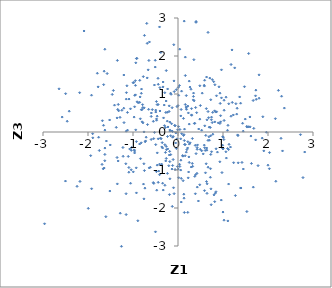
| Category | Series 0 |
|---|---|
| 2.03120851423108 | -0.966 |
| 0.6380926272378209 | -0.421 |
| 1.4215352233544785 | -0.802 |
| 0.0618896957430254 | 0.423 |
| 1.2871835639577025 | 0.745 |
| -1.0912993337554795 | -0.935 |
| 0.7930680771447751 | 1.324 |
| 0.8462634296984827 | -0.442 |
| 0.27058960232429025 | -0.286 |
| 0.584641239548479 | -0.345 |
| 1.2364435287591777 | -0.808 |
| 2.1742855629542954 | -1.297 |
| 0.3863876955118836 | -1.626 |
| -0.2788882041977651 | -0.538 |
| -0.23696091154944107 | 0.287 |
| 0.9925461143902533 | -0.348 |
| -1.0728897451103232 | -0.447 |
| 1.8713023107273214 | -0.161 |
| 0.9657842777513779 | 1.636 |
| 0.4147450287659612 | 0.508 |
| 0.05975740389826087 | -0.18 |
| 1.3254545573414571 | -0.077 |
| 0.37273713275025366 | -1.167 |
| -1.3186778673241994 | 0.557 |
| -0.7453621162487355 | 2.542 |
| -2.2430237134671027 | -1.43 |
| -0.8328264022142614 | -0.703 |
| 0.23135628487303236 | 0.502 |
| -0.3613692791000093 | -0.847 |
| 1.134409014168927 | -0.324 |
| -0.9085548721926571 | 0.794 |
| -0.10742648629825179 | -0.726 |
| -1.652052161703114 | 1.246 |
| 0.6679956220573496 | 2.621 |
| 0.15823453677162813 | -0.625 |
| -1.3715809611399337 | 0.122 |
| 0.5263265302888538 | 0.047 |
| -0.97220790066872 | -0.472 |
| -0.8493367787775357 | 1.36 |
| 0.1410190143220701 | -2.118 |
| 0.3930467419920333 | -1.123 |
| -1.5740185364087167 | 1.538 |
| -1.9400056026471983 | -0.623 |
| -1.5196097550640792 | 0.316 |
| -1.1492986922592545 | 0.866 |
| -0.26058699950445463 | -0.696 |
| -0.5232322655399885 | 1.236 |
| 0.6447142994476656 | 0.32 |
| -0.09943830213728103 | -1.468 |
| -1.5907675174995723 | -0.238 |
| -0.008364926096423737 | 0.057 |
| 0.48386190445106075 | -1.389 |
| 0.10229563728664204 | -0.619 |
| 0.965633094822023 | 0.898 |
| -0.35112947069924044 | -0.28 |
| -0.8148555747264425 | 1.019 |
| -0.9273283446574865 | -0.943 |
| 0.16307379601566113 | -0.332 |
| 1.9068514845797053 | -0.497 |
| -0.885749578718171 | 0.77 |
| -0.2565232240090893 | -0.466 |
| 0.1854646355270571 | -0.529 |
| -0.5481054931863547 | 0.281 |
| 1.3323276474267511 | -0.095 |
| 2.8156992451498764 | -0.528 |
| -1.247214070944625 | 0.572 |
| -2.1781296409141184 | -1.301 |
| -1.2049699411168855 | 0.626 |
| 0.48533245789821655 | 0.339 |
| -0.22814747345436087 | -0.446 |
| 0.538850646723118 | 1.022 |
| -0.7074288939866151 | -0.136 |
| 0.6046063527278297 | -0.486 |
| 0.6673271521674686 | 0.539 |
| -0.23301209197587175 | -0.119 |
| 1.2291107610464314 | 0.449 |
| 1.0228488442547026 | -2.321 |
| -1.0296401667276533 | -0.406 |
| 0.16189976953480814 | 0.724 |
| 0.937708650166596 | 0.752 |
| -0.30563871869331644 | 0.71 |
| 0.039771138110173715 | -0.907 |
| -1.5145159712610154 | -1.554 |
| -0.5919505054547642 | 0.5 |
| 0.9461397636297907 | 0.429 |
| -1.7748875279486203 | 1.187 |
| -0.11936705202457763 | -0.882 |
| -0.4634168051360489 | 0.72 |
| 1.965085368716691 | -0.007 |
| 0.8401632316051432 | 0.525 |
| -0.8414974713543812 | 0.923 |
| -1.6402911486849379 | -0.948 |
| 1.7796479881384117 | -0.885 |
| -0.08929741519572655 | 1.344 |
| -0.40924532624341775 | -0.845 |
| 0.3429393575789887 | 0.937 |
| -0.27264081102165105 | -0.762 |
| -0.8517087687031069 | 0.78 |
| -0.37370570140455733 | -0.176 |
| -0.476547050783232 | 0.344 |
| 0.40008693374644544 | 2.886 |
| -0.060421957189233995 | 0.165 |
| 0.7995662872111217 | -1.656 |
| 0.39215776956178894 | 0.643 |
| 0.3009875541715066 | 0.615 |
| 0.7704574229073521 | 0.517 |
| 0.28906624776493384 | 1.125 |
| 0.06446833580910417 | -0.741 |
| 0.728156360859254 | -0.59 |
| -1.7923624472891055 | 1.546 |
| 0.6807604722381256 | 0.378 |
| -2.497519738398751 | 1.008 |
| -0.7566583099842213 | -1.76 |
| 0.6982812051356887 | -0.216 |
| 0.26706845391375206 | 1.182 |
| -0.36017406429110804 | -0.393 |
| 1.5377600927129589 | 0.13 |
| 0.4214161121138919 | -1.088 |
| -0.19297654349107266 | -0.605 |
| 1.7248337317978 | -0.208 |
| -0.6627876932471145 | 1.635 |
| 0.5865276189380716 | 1.209 |
| 1.3702576745402866 | 0.922 |
| 0.4018738840208439 | 2.91 |
| -1.6548899417173972 | 0.176 |
| -0.45964475560049683 | -0.549 |
| 1.1277428742198505 | 0.743 |
| -0.7569702016612629 | -0.836 |
| 0.8962726876906973 | 0.24 |
| 0.13141079204823944 | -0.07 |
| -0.7992497752973948 | 0.592 |
| -1.354093013204005 | 0.371 |
| -0.02038424237595726 | -0.18 |
| -0.4020543587169101 | 1.168 |
| 2.3637858296864778 | 0.629 |
| 1.8017494110050138 | 1.504 |
| -1.6248903029922162 | -0.589 |
| 1.107535789450467 | -2.34 |
| 1.02511469022449 | 0.573 |
| 1.124490385677927 | -1.37 |
| -0.20452158779356414 | -0.887 |
| 0.21791251330639946 | -2.115 |
| 0.7603294801492564 | 0.248 |
| -1.1221912471282933 | 0.049 |
| -0.9473024651688603 | 1.351 |
| -0.6839311623696789 | 1.423 |
| 0.06006999809032871 | -1.002 |
| 0.74394610508488 | 3.056 |
| 0.012352982368187744 | 0.142 |
| -0.036660278153925294 | -0.434 |
| 0.8759512670555262 | -0.529 |
| 1.7371826693139243 | 0.859 |
| 0.9998305357418359 | -2.107 |
| -1.0396209677074673 | -0.994 |
| -0.4620714014825965 | -0.872 |
| -0.4434293036537461 | 1.413 |
| 1.7230553890210984 | 0.952 |
| -1.8965632460419617 | -0.045 |
| 1.6321263505984813 | -0.828 |
| 1.3044683222252125 | 0.471 |
| 0.6270576053918596 | -0.836 |
| -1.1990208308441903 | 0.247 |
| -0.8107079895781242 | 1.13 |
| -1.0547100080356224 | -1.349 |
| -1.2564277797134944 | -3.008 |
| -1.2231836051660467 | -0.408 |
| 0.2505121692383727 | -0.319 |
| -1.6794287548294566 | 0.296 |
| -0.161897620538353 | -0.596 |
| -0.4387068804111355 | 1.256 |
| 0.07042692341648597 | 0.592 |
| -0.15282315113330683 | 0.993 |
| 0.2193886782159087 | -0.256 |
| -0.9743392692940336 | 0.392 |
| 0.7225413625836373 | -0.967 |
| -0.1890637602398564 | -1.648 |
| -0.8367251421221276 | 0.347 |
| -1.3274569233412323 | 0.724 |
| -0.7351056484581358 | -1.478 |
| 0.16327254812980477 | 1.971 |
| 1.5706775862478974 | 2.065 |
| -0.2797782534020779 | 0.117 |
| -0.1644393758504463 | -0.097 |
| -0.4004850732525856 | 0.553 |
| 1.6708999540223062 | 0.829 |
| 1.7305088911863902 | 1.102 |
| -1.1051419062858445 | -0.643 |
| 2.322770487876884 | -0.498 |
| -0.18042515946923676 | 0.024 |
| -0.7703487089854117 | 1.457 |
| -0.684670462488979 | 2.334 |
| -1.686992137810337 | -0.853 |
| 2.721983637185016 | -0.07 |
| 0.7377783120565559 | -1.914 |
| 0.7427711868332664 | 0.323 |
| -0.012841215020552412 | -0.91 |
| 0.1400481435943803 | -0.225 |
| -0.4934629812035567 | 0.525 |
| 0.07258738315439299 | -1.843 |
| 1.477605541478177 | 1.192 |
| -0.9929209013687255 | -1.049 |
| -0.2348178730352613 | -1.089 |
| 0.2491505033797529 | -0.801 |
| -1.5051274356364979 | -0.342 |
| -1.150956721967325 | 0.021 |
| -0.537643223693889 | -1.353 |
| -1.6411467370087576 | 1.6 |
| -0.14312733058023439 | 0.218 |
| 0.6473122687963895 | -1.363 |
| 0.18446660798281334 | 0.958 |
| 0.7623350221390072 | 1.379 |
| -0.32774831379401514 | -1.528 |
| -2.6429426375321503 | 1.136 |
| -0.06514262615544474 | -0.987 |
| -2.461531669959255 | 0.283 |
| 1.8855890083727507 | 0.401 |
| 1.5288729477324603 | 0.147 |
| -0.34150597227342133 | -1.348 |
| -0.7205171014917541 | -0.235 |
| -1.7639146915076378 | -0.138 |
| 2.2309473395456876 | 1.096 |
| -1.055628881598338 | 0.611 |
| 1.1245676795719182 | -0.462 |
| -2.5738054900689793 | 0.393 |
| -0.9242831362350243 | 1.933 |
| 0.1223821104752984 | -0.092 |
| -1.3470978771586666 | 1.884 |
| -1.6243173671698863 | -0.423 |
| 0.7269526556662154 | -0.099 |
| 1.4517923454722974 | -0.974 |
| 0.35846074913876164 | 0.82 |
| 1.530766743200824 | -2.094 |
| 0.6411043289936558 | -0.478 |
| 0.930060546517262 | -0.784 |
| 1.4496550983388448 | 0.023 |
| 1.3973886770123323 | -1.475 |
| 1.495305630408304 | 0.34 |
| 0.4605828165743575 | 0.079 |
| 0.0009683490402720616 | 0.694 |
| 1.3386330393836674 | -0.811 |
| 0.18466531357444652 | 0.635 |
| 0.3255815486018691 | -0.903 |
| 0.8207917245757703 | 1.244 |
| 0.6300237274436138 | 0.615 |
| 0.21849207642636712 | 0.682 |
| -0.8525391313065561 | -0.316 |
| 1.0189097840616879 | -0.197 |
| 0.8580550240556609 | 0.532 |
| -0.5703243668184629 | 0.59 |
| -0.22290164902077086 | 0.133 |
| 0.7737841573645526 | -0.058 |
| -0.3329020734951593 | 1.186 |
| 0.014466404233050721 | 0.967 |
| -0.47932740461851436 | -1.044 |
| 1.166313108658835 | -0.396 |
| -1.2082964251904524 | -3.179 |
| 1.1782644466162628 | 0.415 |
| 0.582359482567699 | 1.231 |
| -0.998270020390144 | 1.296 |
| 1.6741657172903954 | -1.451 |
| 0.12951236497136356 | -1.637 |
| 0.24149042080330654 | -0.656 |
| -0.18139645717775035 | -0.779 |
| 0.29500544096791476 | -0.922 |
| 0.7172116966502751 | 0.119 |
| 1.3911014773454884 | 0.758 |
| 0.03713304754663213 | 2.18 |
| -0.39100588903861505 | -0.163 |
| 0.08205308102389465 | -0.045 |
| -0.6399167408872265 | -0.945 |
| 1.2060936940360398 | 0.778 |
| -0.44075235989616585 | 0.723 |
| 2.164516187592801 | 0.351 |
| 0.13786097870815767 | 2.918 |
| -0.13467100871409543 | -0.975 |
| -1.3543679057872855 | -0.671 |
| -0.5004078524427933 | -2.627 |
| -0.3416345512434298 | -0.422 |
| 2.7777519810874005 | -1.2 |
| -0.1341500688076392 | 0.027 |
| -0.9601454968847273 | 0.964 |
| 1.065451192941444 | -0.521 |
| 0.7200896984920314 | -1.191 |
| 0.07952149311321782 | 1.075 |
| -0.5057784826144435 | 1.709 |
| 0.6675006922701778 | -0.221 |
| 0.8183338133844088 | 0.266 |
| 0.1346299387039487 | -1.742 |
| -0.18195284645186643 | 0.053 |
| 1.199997028593207 | 2.16 |
| 0.4293996564606899 | -1.45 |
| 0.0728032796922534 | -1.221 |
| -0.5405796804086312 | -0.174 |
| 0.24994116763161509 | 1.339 |
| 0.745408430749935 | 0.391 |
| 0.5912504489032662 | 1.362 |
| 0.424812553827198 | -0.409 |
| -0.04837940584732547 | -0.025 |
| 0.6877498062760925 | -0.126 |
| -0.43954886591281284 | -0.18 |
| 0.9954353611717833 | -0.123 |
| 0.8140417253766462 | 0.556 |
| -0.5954940584783552 | -0.196 |
| -0.4950673498922876 | -0.333 |
| -0.19877019459649387 | 0.54 |
| -1.2037998834773542 | 1.5 |
| -0.9449634964392402 | 1.227 |
| 0.30371903593215327 | 0.44 |
| 0.633009725398936 | -1.303 |
| 0.19031663947288083 | 0.596 |
| 0.7318729255203008 | -1.496 |
| 0.993985624217695 | -0.437 |
| -0.036864504043420766 | 1.115 |
| -0.9394030630191293 | 0.057 |
| 0.013533401087857526 | -1.202 |
| -0.18563038882263722 | -0.51 |
| -2.4170549401792125 | 0.548 |
| -1.0921739170660414 | -1.058 |
| 0.4335274350143891 | -0.34 |
| -1.7488944741817858 | -0.487 |
| -0.5057635131311345 | 1.888 |
| -0.9248015867194376 | -0.253 |
| -0.6940834797407236 | 2.858 |
| 0.9317173821395797 | 0.225 |
| 0.5930083537873714 | -0.414 |
| -0.29990974688999067 | 0.167 |
| -0.981614578872564 | 1.303 |
| -0.26290511926410376 | 0.816 |
| -0.9124929484648598 | 1.939 |
| 0.23572114740063294 | -1.052 |
| -1.1540884249497219 | -1.624 |
| -0.020744435640049352 | 0.667 |
| 0.12172405562661838 | 0.358 |
| -1.3295708914959001 | -0.763 |
| -1.3473858143056996 | -1.365 |
| 0.9470196670188338 | 0.267 |
| -0.5489218937078486 | -1.331 |
| 1.9992044398148632 | -0.873 |
| -0.7871500930391641 | 0.719 |
| 0.0058951784768085744 | -0.976 |
| -1.4616844609789088 | 0.988 |
| -0.28986976053490254 | -1.402 |
| 0.8157064643144257 | -1.834 |
| -0.2910733426304776 | -0.335 |
| 0.2277374185401185 | -1.207 |
| -0.4105093488334182 | 2.764 |
| -0.29394779858041803 | 1.033 |
| -0.6532174471195247 | 0.597 |
| -0.0862373369672945 | -1.622 |
| 0.3173431265591577 | -0.828 |
| 1.1013125204922698 | -0.435 |
| 0.006140326447311107 | 1.173 |
| -0.4768000741331179 | 0.31 |
| 0.32011671439693934 | -0.172 |
| 0.6178100060176094 | -0.089 |
| 0.4260579797188015 | -0.456 |
| 1.0751025652010318 | -0.686 |
| 0.1439486127769097 | -0.328 |
| -0.10716327246990236 | -0.118 |
| 0.03308653354793722 | 1.223 |
| -0.12078024508411091 | -0.137 |
| -0.18054337034168894 | 0.26 |
| 0.6937106047405537 | 0.129 |
| 2.2894471039196915 | -0.166 |
| -1.1594466017193161 | -0.836 |
| 1.0240311386956915 | 0.304 |
| 0.1971505121506946 | -0.464 |
| -1.1341601451981531 | 1.216 |
| 0.6346789868596819 | 1.446 |
| -0.3205978396403933 | 0.371 |
| -0.17944249516405425 | -1.232 |
| -0.4400805502876557 | -1.325 |
| 1.3140000217917003 | 0.625 |
| 0.6108421128553749 | -1.074 |
| -0.5955834725669198 | 0.409 |
| 0.855615215297404 | 0.953 |
| 1.1782188226554546 | 1.776 |
| -0.7972328177831958 | 0.267 |
| -1.4109622924836602 | 0.706 |
| -1.625612037393271 | 2.178 |
| 0.7278956877688509 | 0.849 |
| -0.5218045139452976 | -0.012 |
| 0.7070654520583484 | 1.419 |
| 1.6200741334289184 | -0.107 |
| 1.0038938931000294 | -0.441 |
| 0.34555199237786 | 1.024 |
| -0.26047740452521856 | 1.616 |
| -0.33065309071101906 | 1.316 |
| 0.5610930209270284 | -0.577 |
| 0.6448294316121703 | -1.615 |
| -0.7291953074585305 | -0.257 |
| 0.1627098468214491 | 1.486 |
| 0.10806705513290601 | -0.635 |
| -0.23066185847236864 | 1.132 |
| -0.13058077078449953 | 0.64 |
| 0.3738043040154474 | 0.229 |
| -0.7519250832502837 | 0.635 |
| -0.2711860943194124 | 0.514 |
| -0.4283547791153228 | -1.029 |
| 2.3011745348395247 | 0.942 |
| 1.1107377198049238 | 0.176 |
| 0.5255544155751644 | -0.495 |
| -0.008436983143597355 | 3.213 |
| -2.0876174370063887 | 2.658 |
| 0.033365693322464786 | -0.85 |
| -0.38038846715918156 | 2.094 |
| -1.892933264321624 | -0.154 |
| -1.624891904438697 | 0.05 |
| 0.49441417604134263 | -0.456 |
| 0.45406087381067256 | -1.816 |
| -0.23579583923886455 | 0.519 |
| 0.8441681775780651 | -1.573 |
| -1.9217714432936246 | 0.968 |
| -0.6765609200648942 | 0.196 |
| 0.3003734460664268 | 0.45 |
| 2.033859787535725 | -0.542 |
| 1.2755266423605045 | -1.673 |
| 0.2138581497499271 | -0.42 |
| -0.4790820664832568 | 0.802 |
| -0.1949523627932929 | 0.687 |
| -0.964569351903321 | -0.551 |
| -0.7828296145319283 | 0.645 |
| 0.401881140982674 | -0.569 |
| 0.33972314142154586 | 0.844 |
| 0.9623404707138572 | -1.791 |
| 1.0998468982848153 | 0.045 |
| -0.9639430109561117 | 0.664 |
| -0.8141293854772979 | 0.585 |
| 1.3911195833647891 | -1.472 |
| -1.1458534542879175 | 1.035 |
| -0.9463728537393533 | 0.977 |
| -1.3391975463264034 | 0.593 |
| 1.5712879758537097 | 0.139 |
| 0.589297844878256 | -1.543 |
| 0.3533681685030862 | 1.904 |
| -0.9374571678937006 | 1.82 |
| 0.5946823053230665 | 0.163 |
| 0.04165595418333012 | 0.066 |
| 1.0681359154028924 | 0.916 |
| 1.800937958205329 | 0.889 |
| -0.63431289390713 | 2.37 |
| -1.0874186199935965 | 0.867 |
| -0.09380515146080738 | 2.297 |
| -1.2825502376332092 | -2.137 |
| -1.288866934538377 | 0.385 |
| -0.16421377021390554 | 1.021 |
| -1.0374690937460773 | -0.483 |
| 0.9773195044921432 | -1.068 |
| 0.3831371519529941 | -0.351 |
| 0.668574057785756 | -0.926 |
| -2.500952602091171 | -1.291 |
| -0.6148336134026382 | -0.928 |
| 1.435324656595383 | 0.23 |
| -1.219514510356616 | -0.64 |
| -0.05292181436573296 | -0.289 |
| -0.4096523796771581 | -1.124 |
| 1.5976749934521814 | 0.396 |
| -0.47225388585296557 | -1.532 |
| 0.18493965334009704 | 0.661 |
| -0.7465162956745369 | -1.016 |
| -0.08236159391264086 | 1.064 |
| -0.7779508429586933 | 0.241 |
| -1.6025862443710306 | -2.228 |
| 1.259413293618899 | 1.687 |
| -1.9937018746077526 | -2.009 |
| -1.9202943591028194 | -1.493 |
| 0.14454123837671695 | 0.076 |
| -2.9657393285675475 | -2.415 |
| -1.1231387273967208 | 0.515 |
| -0.26159493985111765 | -0.38 |
| -1.1521565816476766 | -2.173 |
| 1.0058882875708581 | -0.139 |
| -0.46286098790990254 | 0.417 |
| 1.6846513963315393 | 0.095 |
| 0.11327751192596962 | -1.281 |
| -0.8921608953594743 | -2.336 |
| -0.7548952385625379 | 0.002 |
| -0.6463512560012521 | 1.883 |
| -0.8173111858155767 | -0.284 |
| 0.9336284328497383 | 1.021 |
| -0.12696671593190867 | -1.958 |
| 0.363596371643133 | 0.227 |
| -1.6268306238595134 | -0.756 |
| -0.4951302033603606 | 0.576 |
| -1.6620016940642666 | -0.969 |
| 0.48554055790377393 | 1.217 |
| -0.9636412412212333 | -0.499 |
| 0.7452763424068695 | -0.519 |
| -2.1854440336400796 | 1.034 |
| -0.07599688798176545 | 0.173 |
| 1.6025362732713453 | 0.135 |
| 0.911186722207672 | 1.189 |
| 1.0229837254403356 | 0.836 |
| -0.9236478993403013 | -1.603 |
| -1.4360056662746923 | 1.093 |
| 0.8276809167523478 | -1.611 |
| -0.11950311065949533 | 0.01 |
| 0.25001835921090343 | 0.208 |
| 0.49754581575426676 | 0.696 |
| -0.7666673433153001 | -1.37 |